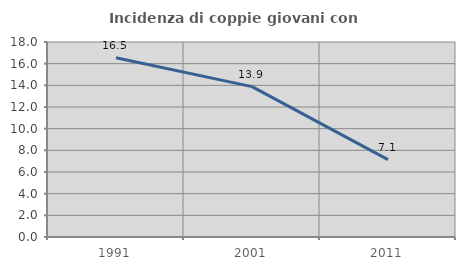
| Category | Incidenza di coppie giovani con figli |
|---|---|
| 1991.0 | 16.549 |
| 2001.0 | 13.879 |
| 2011.0 | 7.143 |